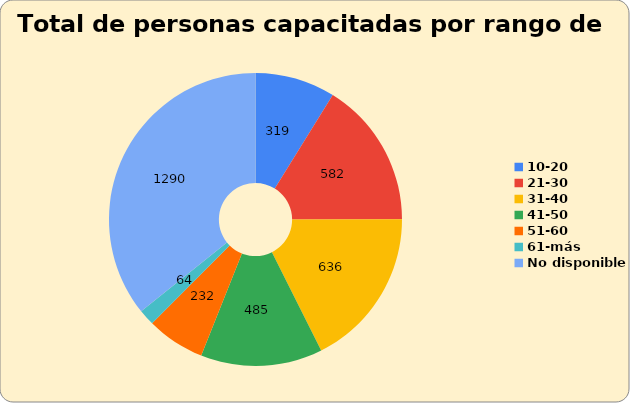
| Category | Cantidad de personas capacitadas por edad |
|---|---|
| 10-20 | 319 |
| 21-30 | 582 |
| 31-40 | 636 |
| 41-50 | 485 |
| 51-60 | 232 |
| 61-más | 64 |
| No disponible | 1290 |